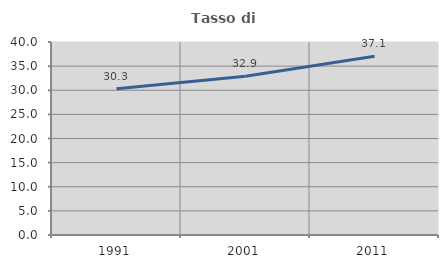
| Category | Tasso di occupazione   |
|---|---|
| 1991.0 | 30.321 |
| 2001.0 | 32.918 |
| 2011.0 | 37.051 |